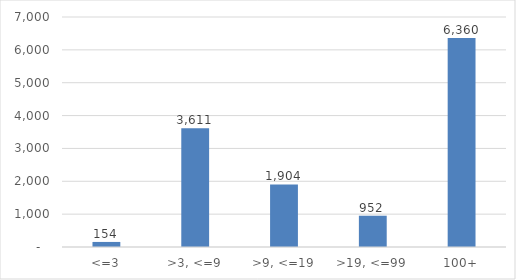
| Category |  Employees |
|---|---|
| <=3 | 154 |
| >3, <=9 | 3611.2 |
| >9, <=19 | 1904.1 |
| >19, <=99 | 952 |
| 100+ | 6360 |